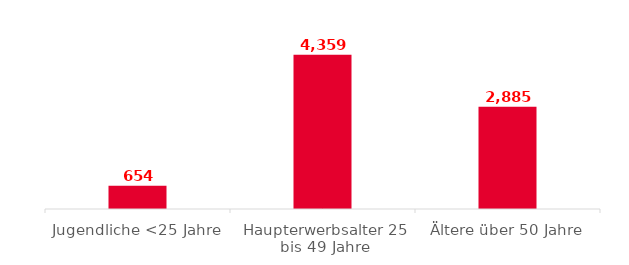
| Category | Ktn |
|---|---|
| Jugendliche <25 Jahre | 654 |
| Haupterwerbsalter 25 bis 49 Jahre | 4359 |
| Ältere über 50 Jahre | 2885 |